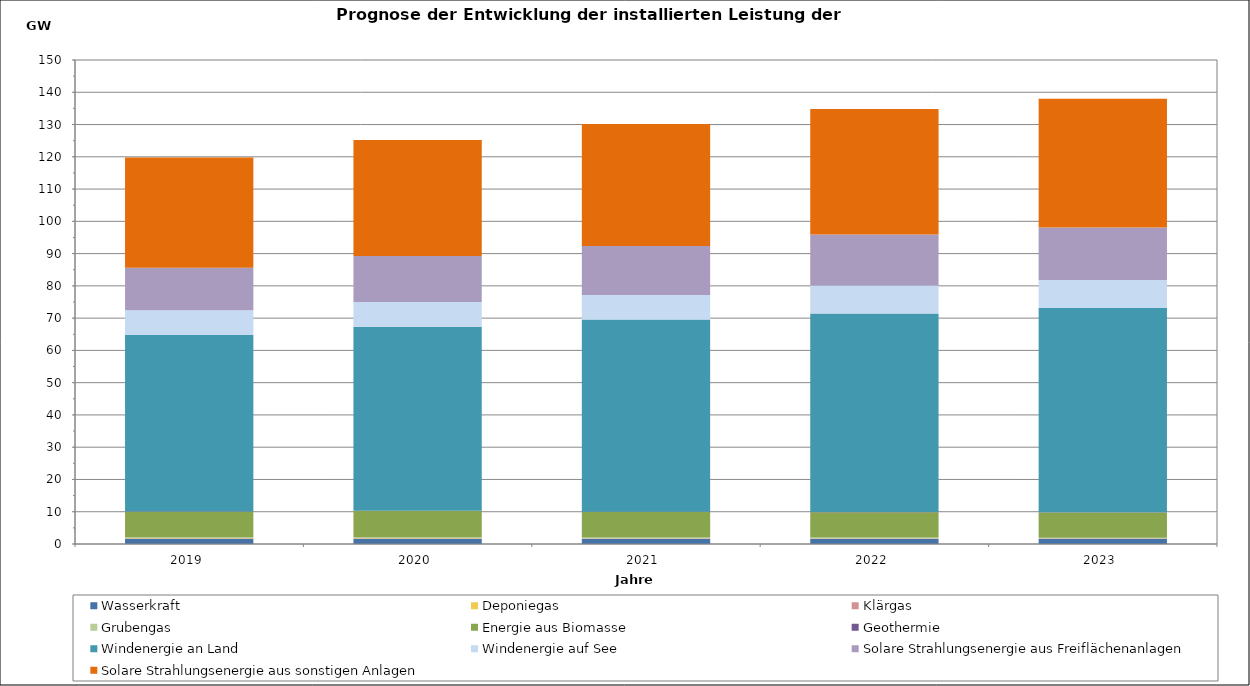
| Category | Wasserkraft | Deponiegas | Klärgas | Grubengas | Energie aus Biomasse | Geothermie | Windenergie an Land | Windenergie auf See | Solare Strahlungsenergie aus Freiflächenanlagen | Solare Strahlungsenergie aus sonstigen Anlagen |
|---|---|---|---|---|---|---|---|---|---|---|
| 2019.0 | 1617.52 | 172.56 | 95.27 | 232.76 | 7875 | 47.21 | 54711.79 | 7659 | 13240.73 | 34151.29 |
| 2020.0 | 1629.11 | 171.52 | 95.97 | 231.76 | 8149.14 | 51.11 | 57038.59 | 7659 | 14212.16 | 35970.98 |
| 2021.0 | 1640.7 | 77.08 | 96.67 | 198.69 | 7899.28 | 55.02 | 59570.29 | 7659 | 15126.4 | 37837.86 |
| 2022.0 | 1652.29 | 55.43 | 97.37 | 179.1 | 7838.37 | 58.92 | 61532.46 | 8716.9 | 15796.06 | 38876.01 |
| 2023.0 | 1663.88 | 52.31 | 98.07 | 110.38 | 7837.91 | 62.82 | 63302 | 8716.9 | 16271.28 | 39908.02 |